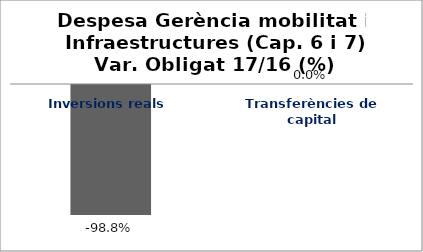
| Category | Series 0 |
|---|---|
| Inversions reals | -0.988 |
| Transferències de capital | 0 |